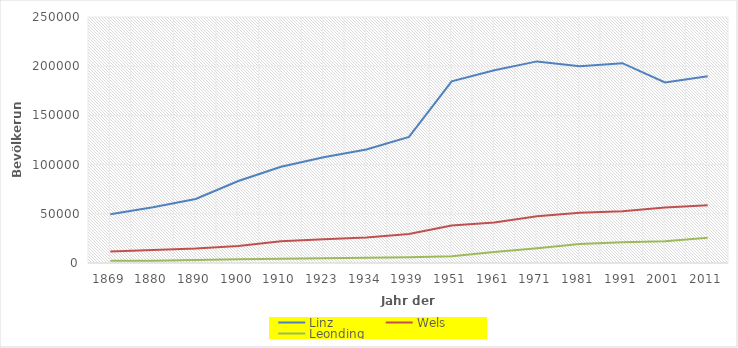
| Category | Linz | Wels | Leonding |
|---|---|---|---|
| 1869 | 49635 | 11704 | 2250 |
| 1880 | 56569 | 13175 | 2378 |
| 1890 | 65090 | 14735 | 3016 |
| 1900 | 83356 | 17308 | 3829 |
| 1910 | 97852 | 22015 | 4365 |
| 1923 | 107463 | 24248 | 4762 |
| 1934 | 115338 | 25956 | 5235 |
| 1939 | 128177 | 29533 | 5771 |
| 1951 | 184685 | 38120 | 6832 |
| 1961 | 195978 | 41060 | 11211 |
| 1971 | 204889 | 47527 | 14968 |
| 1981 | 199910 | 51060 | 19389 |
| 1991 | 203044 | 52594 | 21209 |
| 2001 | 183504 | 56478 | 22203 |
| 2011 | 189889 | 58591 | 25582 |